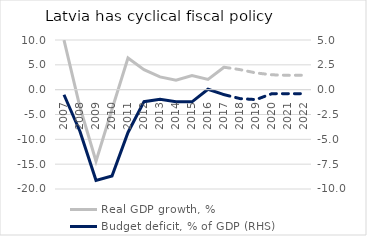
| Category | Real GDP growth, % |
|---|---|
| 2007 | 9.979 |
| 2008 | -3.548 |
| 2009 | -14.402 |
| 2010 | -3.941 |
| 2011 | 6.381 |
| 2012 | 4.035 |
| 2013 | 2.58 |
| 2014 | 1.913 |
| 2015 | 2.837 |
| 2016 | 2.076 |
| 2017 | 4.521 |
| 2018 | 4.033 |
| 2019 | 3.367 |
| 2020 | 2.995 |
| 2021 | 2.892 |
| 2022 | 2.9 |